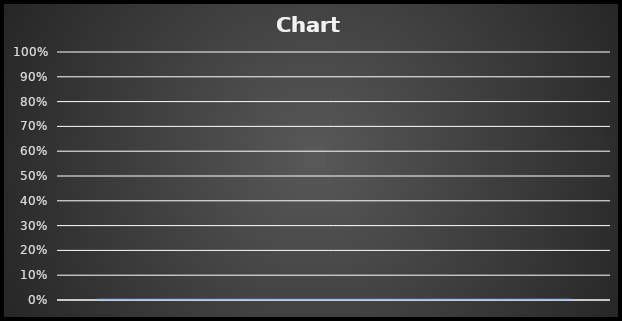
| Category | Sleep Efficiency for Week 3 | Goal |
|---|---|---|
|  | 0 |  |
|  | 0 |  |
|  | 0 |  |
|  | 0 |  |
|  | 0 |  |
|  | 0 |  |
|  | 0 |  |